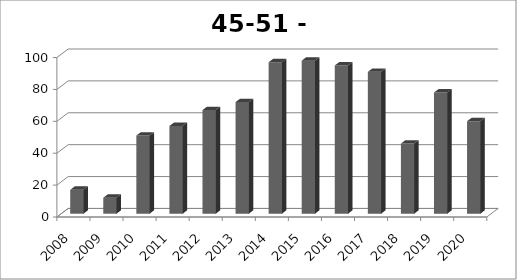
| Category | Haaren |
|---|---|
| 2008.0 | 15 |
| 2009.0 | 10 |
| 2010.0 | 49 |
| 2011.0 | 55 |
| 2012.0 | 65 |
| 2013.0 | 70 |
| 2014.0 | 95 |
| 2015.0 | 96 |
| 2016.0 | 93 |
| 2017.0 | 89 |
| 2018.0 | 44 |
| 2019.0 | 76 |
| 2020.0 | 58 |